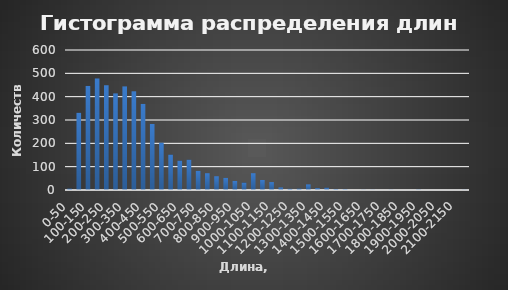
| Category | Series 0 |
|---|---|
| 0-50 | 6 |
| 50-100 | 331 |
| 100-150 | 446 |
| 150-200 | 478 |
| 200-250 | 449 |
| 250-300 | 414 |
| 300-350 | 444 |
| 350-400 | 423 |
| 400-450 | 369 |
| 450-500 | 283 |
| 500-550 | 203 |
| 550-600 | 152 |
| 600-650 | 126 |
| 650-700 | 130 |
| 700-750 | 82 |
| 750-800 | 72 |
| 800-850 | 59 |
| 850-900 | 52 |
| 900-950 | 39 |
| 950-1000 | 32 |
| 1000-1050 | 72 |
| 1050-1100 | 43 |
| 1100-1150 | 34 |
| 1150-1200 | 11 |
| 1200-1250 | 5 |
| 1250-1300 | 6 |
| 1300-1350 | 24 |
| 1350-1400 | 8 |
| 1400-1450 | 10 |
| 1450-1500 | 4 |
| 1500-1550 | 3 |
| 1550-1600 | 0 |
| 1600-1650 | 1 |
| 1650-1700 | 1 |
| 1700-1750 | 0 |
| 1750-1800 | 1 |
| 1800-1850 | 0 |
| 1850-1900 | 0 |
| 1900-1950 | 2 |
| 1950-2000 | 0 |
| 2000-2050 | 0 |
| 2050-2100 | 0 |
| 2100-2150 | 0 |
| 2150-2200 | 1 |